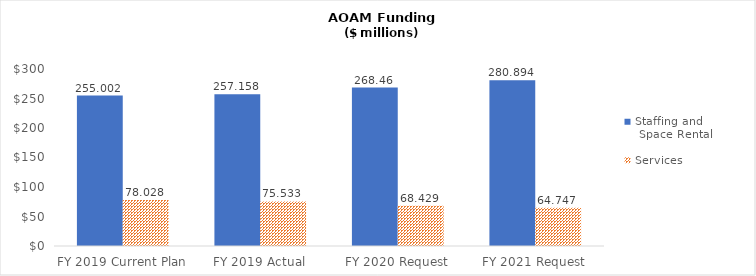
| Category | Staffing and
 Space Rental | Services |
|---|---|---|
| FY 2019 Current Plan | 255.002 | 78.028 |
| FY 2019 Actual | 257.158 | 75.533 |
| FY 2020 Request | 268.46 | 68.429 |
| FY 2021 Request | 280.894 | 64.747 |